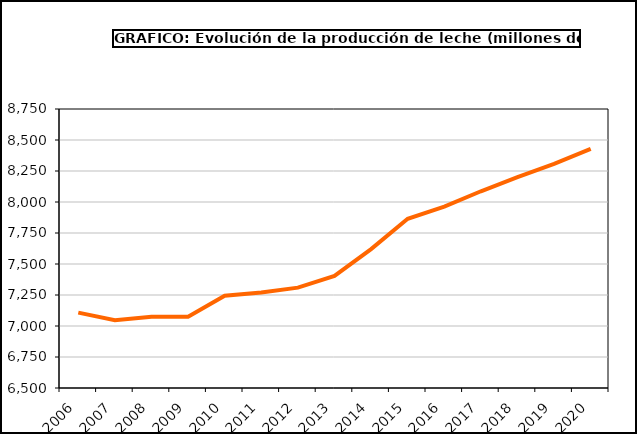
| Category | Total leche |
|---|---|
| 2006.0 | 7107.75 |
| 2007.0 | 7046.085 |
| 2008.0 | 7074.769 |
| 2009.0 | 7073.924 |
| 2010.0 | 7244.584 |
| 2011.0 | 7270 |
| 2012.0 | 7309.156 |
| 2013.0 | 7403.744 |
| 2014.0 | 7620.059 |
| 2015.0 | 7864.78 |
| 2016.0 | 7963.056 |
| 2017.0 | 8086.554 |
| 2018.0 | 8200.102 |
| 2019.0 | 8307.393 |
| 2020.0 | 8428.565 |